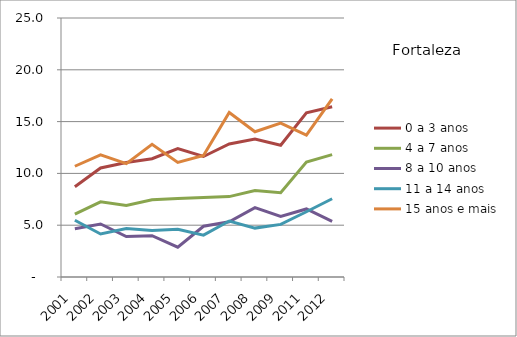
| Category | 0 a 3 anos | 4 a 7 anos | 8 a 10 anos | 11 a 14 anos | 15 anos e mais |
|---|---|---|---|---|---|
| 2001.0 | 8.72 | 6.07 | 4.65 | 5.48 | 10.69 |
| 2002.0 | 10.52 | 7.26 | 5.12 | 4.15 | 11.79 |
| 2003.0 | 11.05 | 6.9 | 3.9 | 4.69 | 10.94 |
| 2004.0 | 11.42 | 7.45 | 3.99 | 4.49 | 12.8 |
| 2005.0 | 12.4 | 7.58 | 2.88 | 4.61 | 11.06 |
| 2006.0 | 11.63 | 7.68 | 4.9 | 4.04 | 11.73 |
| 2007.0 | 12.84 | 7.76 | 5.33 | 5.4 | 15.88 |
| 2008.0 | 13.32 | 8.34 | 6.7 | 4.72 | 14.02 |
| 2009.0 | 12.72 | 8.14 | 5.85 | 5.08 | 14.85 |
| 2011.0 | 15.84 | 11.09 | 6.57 | 6.3 | 13.7 |
| 2012.0 | 16.43 | 11.81 | 5.37 | 7.55 | 17.2 |